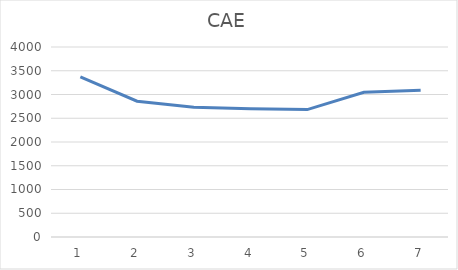
| Category | Series 0 |
|---|---|
| 0 | 3371.429 |
| 1 | 2859.801 |
| 2 | 2729.446 |
| 3 | 2700.947 |
| 4 | 2682.691 |
| 5 | 3047.097 |
| 6 | 3089.609 |